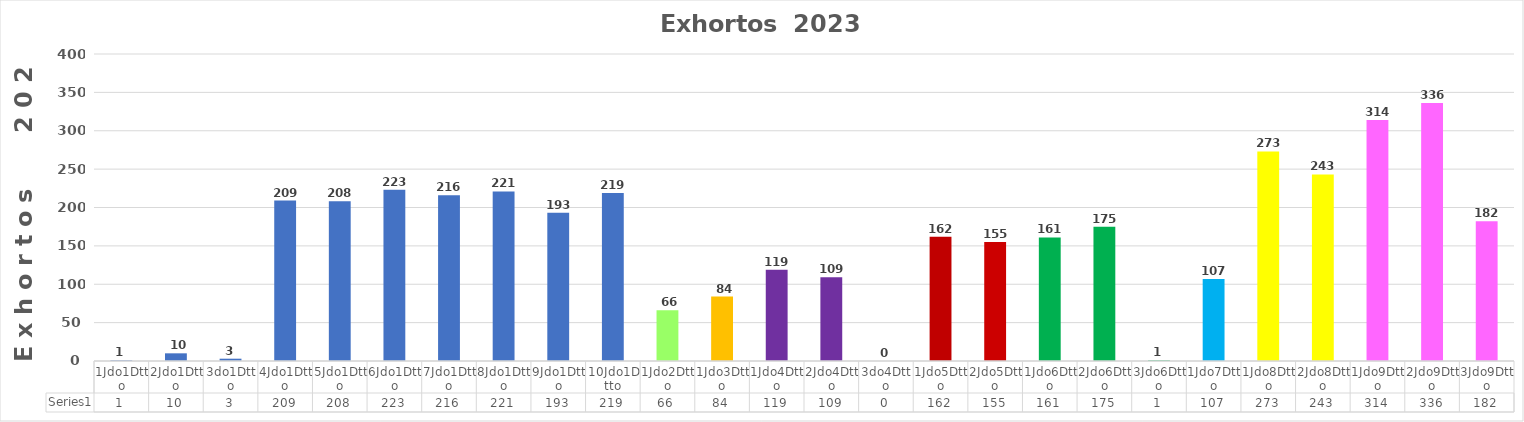
| Category | Series 0 |
|---|---|
| 1Jdo1Dtto | 1 |
| 2Jdo1Dtto | 10 |
| 3do1Dtto | 3 |
| 4Jdo1Dtto | 209 |
| 5Jdo1Dtto | 208 |
| 6Jdo1Dtto | 223 |
| 7Jdo1Dtto | 216 |
| 8Jdo1Dtto | 221 |
| 9Jdo1Dtto | 193 |
| 10Jdo1Dtto | 219 |
| 1Jdo2Dtto | 66 |
| 1Jdo3Dtto | 84 |
| 1Jdo4Dtto | 119 |
| 2Jdo4Dtto | 109 |
| 3do4Dtto | 0 |
| 1Jdo5Dtto | 162 |
| 2Jdo5Dtto | 155 |
| 1Jdo6Dtto | 161 |
| 2Jdo6Dtto | 175 |
| 3Jdo6Dtto | 1 |
| 1Jdo7Dtto | 107 |
| 1Jdo8Dtto | 273 |
| 2Jdo8Dtto | 243 |
| 1Jdo9Dtto | 314 |
| 2Jdo9Dtto | 336 |
| 3Jdo9Dtto | 182 |